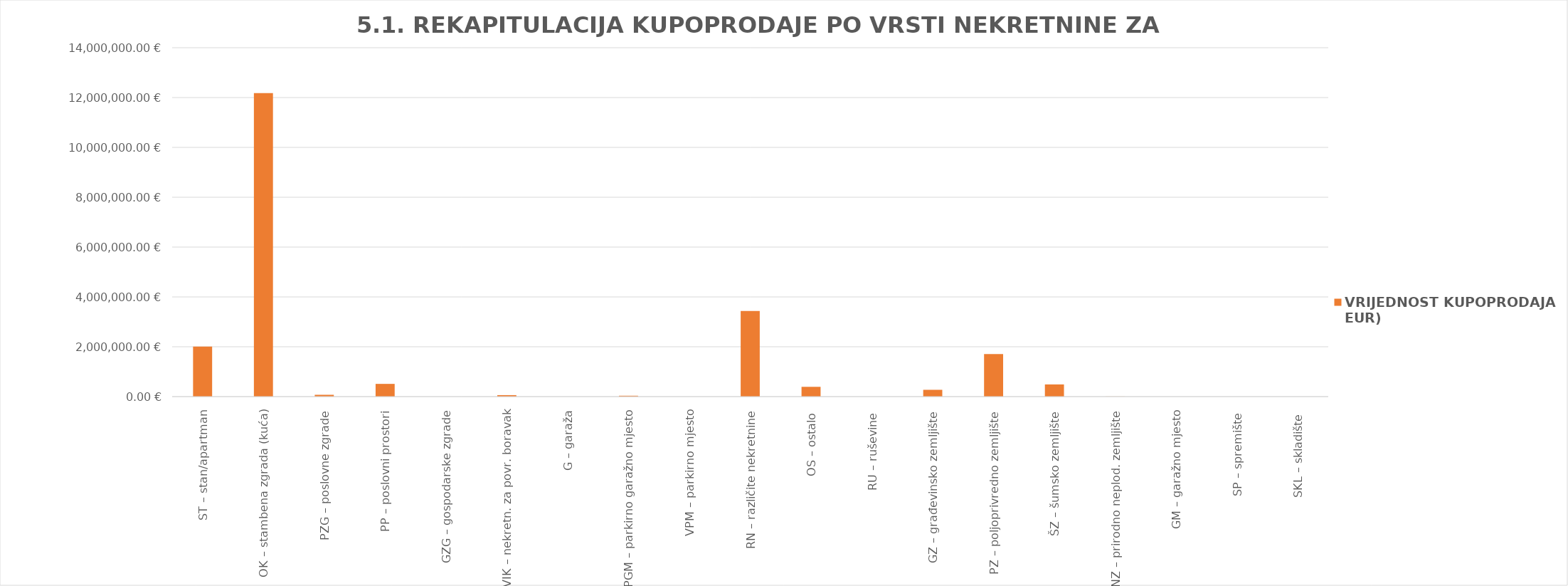
| Category | VRIJEDNOST KUPOPRODAJA (u EUR) |
|---|---|
| ST – stan/apartman | 2006177.241 |
| OK – stambena zgrada (kuća) | 12180984.822 |
| PZG – poslovne zgrade | 72320.2 |
| PP – poslovni prostori | 510332.679 |
| GZG – gospodarske zgrade | 0 |
| VIK – nekretn. za povr. boravak | 59000 |
| G – garaža | 0 |
| PGM – parkirno garažno mjesto | 34839.74 |
| VPM – parkirno mjesto | 0 |
| RN – različite nekretnine | 3436965.894 |
| OS – ostalo  | 392200 |
| RU – ruševine  | 0 |
| GZ – građevinsko zemljište | 272792.192 |
| PZ – poljoprivredno zemljište | 1705036.821 |
| ŠZ – šumsko zemljište | 488596.586 |
| PNZ – prirodno neplod. zemljište | 3194.791 |
| GM – garažno mjesto | 0 |
| SP – spremište  | 0 |
| SKL – skladište  | 0 |